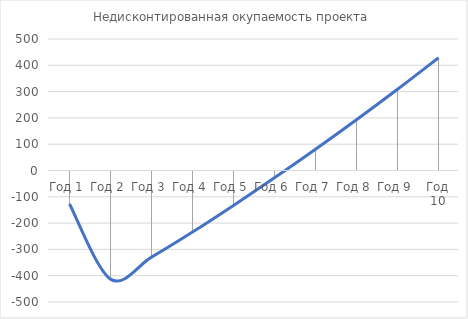
| Category | Недисконтированная окупаемость проекта |
|---|---|
| Год 1 | -127.5 |
| Год 2 | -413.043 |
| Год 3 | -329.54 |
| Год 4 | -234.199 |
| Год 5 | -132.825 |
| Год 6 | -27.953 |
| Год 7 | 80.52 |
| Год 8 | 192.702 |
| Год 9 | 308.701 |
| Год 10 | 428.63 |